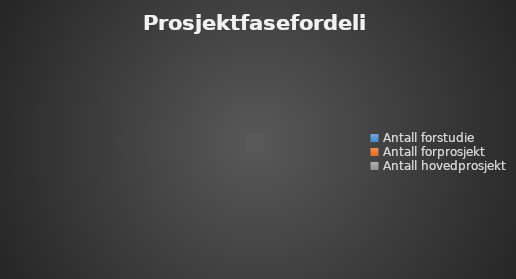
| Category | Series 0 |
|---|---|
| Antall forstudie | 0 |
| Antall forprosjekt | 0 |
| Antall hovedprosjekt | 0 |